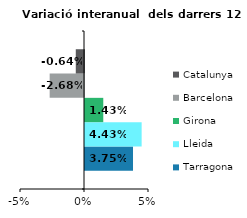
| Category | Tarragona | Lleida | Girona | Barcelona | Catalunya |
|---|---|---|---|---|---|
| 0 | 0.038 | 0.044 | 0.014 | -0.027 | -0.006 |